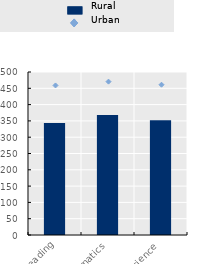
| Category | Rural |
|---|---|
| Reading | 343.59 |
| Mathematics | 368.3 |
| Science | 352.2 |